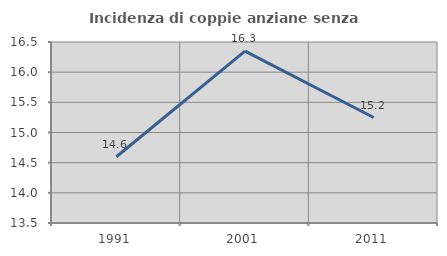
| Category | Incidenza di coppie anziane senza figli  |
|---|---|
| 1991.0 | 14.599 |
| 2001.0 | 16.35 |
| 2011.0 | 15.248 |